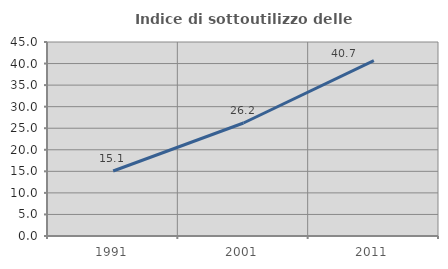
| Category | Indice di sottoutilizzo delle abitazioni  |
|---|---|
| 1991.0 | 15.083 |
| 2001.0 | 26.215 |
| 2011.0 | 40.7 |